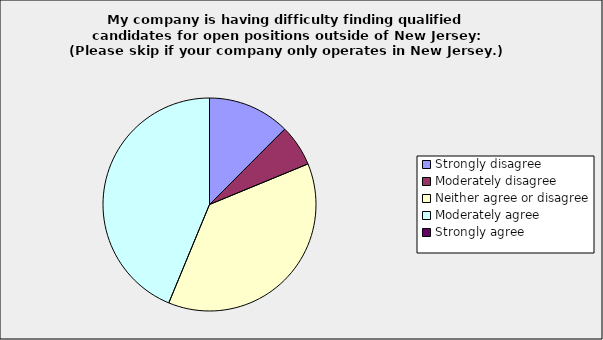
| Category | Series 0 |
|---|---|
| Strongly disagree | 0.125 |
| Moderately disagree | 0.063 |
| Neither agree or disagree | 0.375 |
| Moderately agree | 0.438 |
| Strongly agree | 0 |